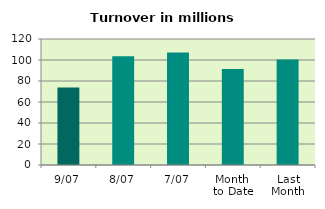
| Category | Series 0 |
|---|---|
| 9/07 | 73.876 |
| 8/07 | 103.638 |
| 7/07 | 107.238 |
| Month 
to Date | 91.364 |
| Last
Month | 100.537 |